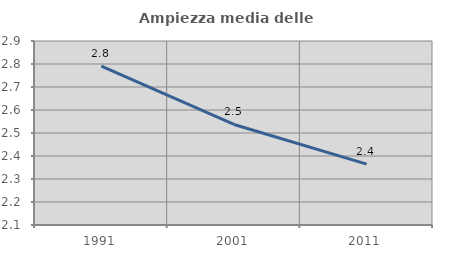
| Category | Ampiezza media delle famiglie |
|---|---|
| 1991.0 | 2.79 |
| 2001.0 | 2.537 |
| 2011.0 | 2.365 |